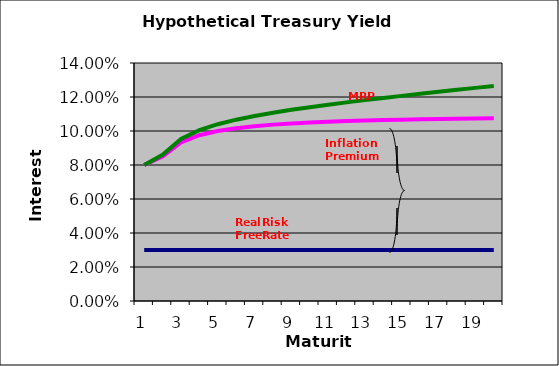
| Category | Real Risk Free Rate | Inflation Premium | Maturity Risk Premium |
|---|---|---|---|
| 0 | 0.03 | 0.05 | 0 |
| 1 | 0.03 | 0.055 | 0.001 |
| 2 | 0.03 | 0.063 | 0.002 |
| 3 | 0.03 | 0.068 | 0.003 |
| 4 | 0.03 | 0.07 | 0.004 |
| 5 | 0.03 | 0.072 | 0.005 |
| 6 | 0.03 | 0.073 | 0.006 |
| 7 | 0.03 | 0.074 | 0.007 |
| 8 | 0.03 | 0.074 | 0.008 |
| 9 | 0.03 | 0.075 | 0.009 |
| 10 | 0.03 | 0.075 | 0.01 |
| 11 | 0.03 | 0.076 | 0.011 |
| 12 | 0.03 | 0.076 | 0.012 |
| 13 | 0.03 | 0.076 | 0.013 |
| 14 | 0.03 | 0.077 | 0.014 |
| 15 | 0.03 | 0.077 | 0.015 |
| 16 | 0.03 | 0.077 | 0.016 |
| 17 | 0.03 | 0.077 | 0.017 |
| 18 | 0.03 | 0.077 | 0.018 |
| 19 | 0.03 | 0.078 | 0.019 |